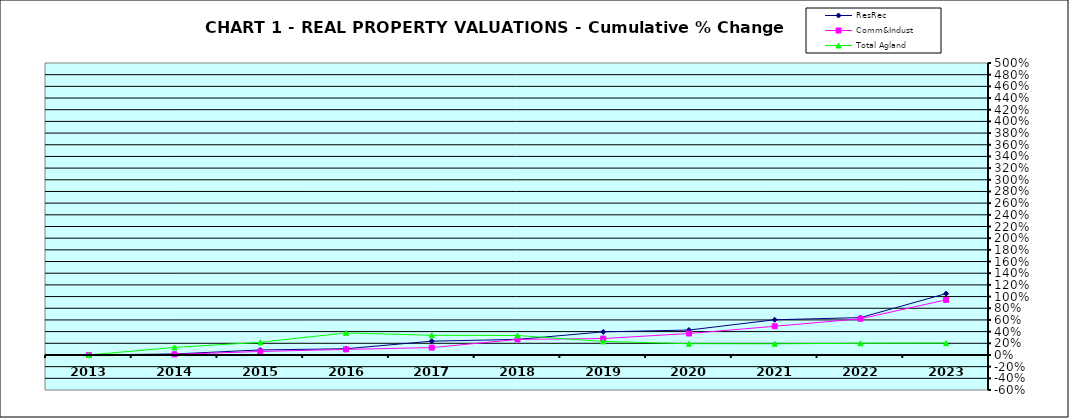
| Category | ResRec | Comm&Indust | Total Agland |
|---|---|---|---|
| 2013.0 | 0 | 0 | 0 |
| 2014.0 | 0.017 | 0.011 | 0.13 |
| 2015.0 | 0.086 | 0.06 | 0.217 |
| 2016.0 | 0.107 | 0.095 | 0.378 |
| 2017.0 | 0.236 | 0.126 | 0.337 |
| 2018.0 | 0.266 | 0.266 | 0.333 |
| 2019.0 | 0.395 | 0.281 | 0.232 |
| 2020.0 | 0.427 | 0.367 | 0.193 |
| 2021.0 | 0.603 | 0.491 | 0.192 |
| 2022.0 | 0.639 | 0.62 | 0.2 |
| 2023.0 | 1.051 | 0.944 | 0.203 |